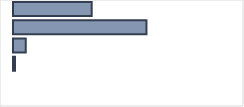
| Category | Series 0 |
|---|---|
| 0 | 34.665 |
| 1 | 58.792 |
| 2 | 5.615 |
| 3 | 0.928 |
| 4 | 0 |